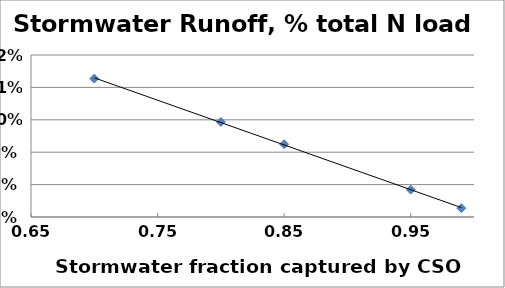
| Category | CSO fraction |
|---|---|
| 0.85 | 0.092 |
| 0.7 | 0.113 |
| 0.95 | 0.078 |
| 0.8 | 0.099 |
| 0.99 | 0.073 |